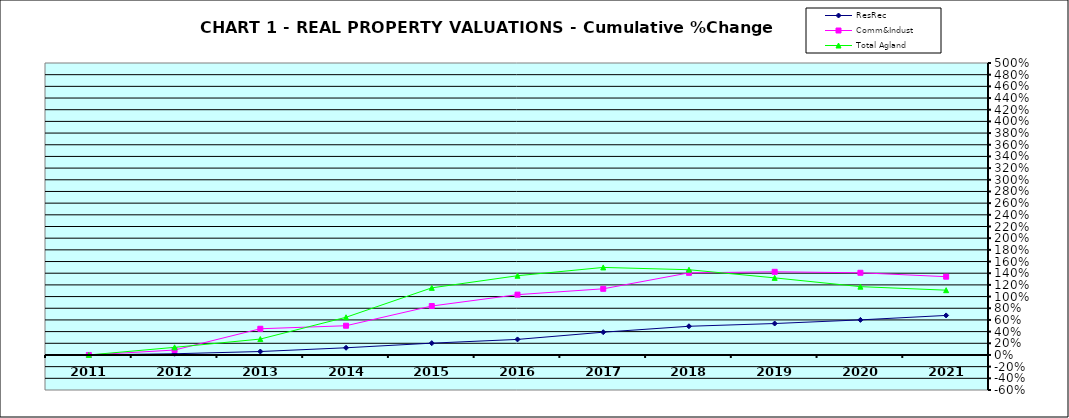
| Category | ResRec | Comm&Indust | Total Agland |
|---|---|---|---|
| 2011.0 | 0 | 0 | 0 |
| 2012.0 | 0.021 | 0.084 | 0.131 |
| 2013.0 | 0.059 | 0.449 | 0.272 |
| 2014.0 | 0.123 | 0.501 | 0.646 |
| 2015.0 | 0.202 | 0.838 | 1.149 |
| 2016.0 | 0.266 | 1.033 | 1.357 |
| 2017.0 | 0.39 | 1.133 | 1.499 |
| 2018.0 | 0.491 | 1.406 | 1.46 |
| 2019.0 | 0.539 | 1.424 | 1.32 |
| 2020.0 | 0.601 | 1.407 | 1.17 |
| 2021.0 | 0.677 | 1.341 | 1.109 |